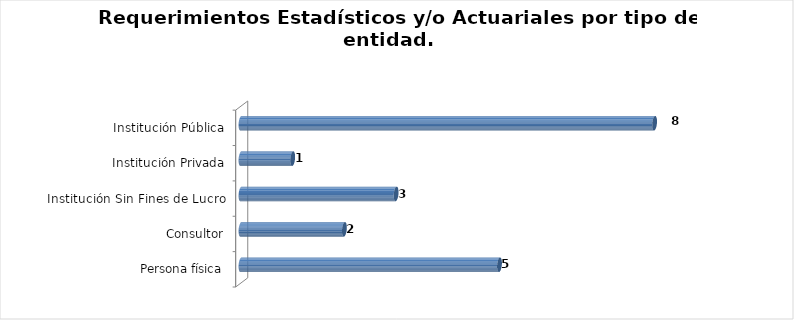
| Category | Total |
|---|---|
| Persona física | 5 |
| Consultor | 2 |
| Institución Sin Fines de Lucro | 3 |
| Institución Privada | 1 |
| Institución Pública | 8 |